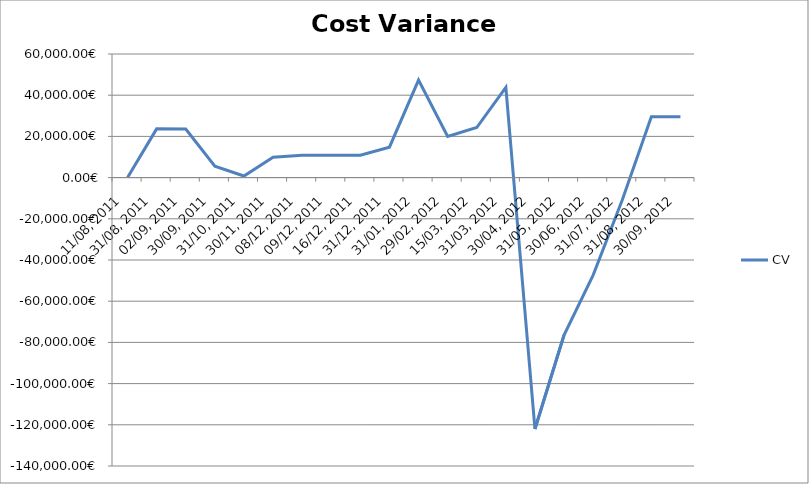
| Category | CV |
|---|---|
| 11/08, 2011 | 0 |
| 31/08, 2011 | 23650.821 |
| 02/09, 2011 | 23535.871 |
| 30/09, 2011 | 5497.65 |
| 31/10, 2011 | 765.49 |
| 30/11, 2011 | 9935.26 |
| 08/12, 2011 | 10881.07 |
| 09/12, 2011 | 10881.07 |
| 16/12, 2011 | 10880.18 |
| 31/12, 2011 | 14782.38 |
| 31/01, 2012 | 47352.939 |
| 29/02, 2012 | 19993.851 |
| 15/03, 2012 | 24304.839 |
| 31/03, 2012 | 43784.969 |
| 30/04, 2012 | -122018.768 |
| 31/05, 2012 | -76422.45 |
| 30/06, 2012 | -47324.581 |
| 31/07, 2012 | -10867.829 |
| 31/08, 2012 | 29490.909 |
| 30/09, 2012 | 29490.909 |